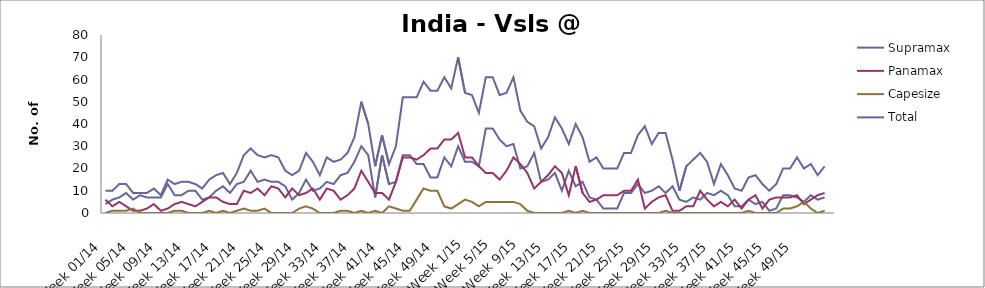
| Category | Supramax | Panamax | Capesize | Total |
|---|---|---|---|---|
| Week 01/14 | 4 | 6 | 0 | 10 |
| Week 02/14 | 6 | 3 | 1 | 10 |
| Week 03/14 | 7 | 5 | 1 | 13 |
| Week 04/14 | 9 | 3 | 1 | 13 |
| Week 05/14 | 6 | 1 | 2 | 9 |
| Week 06/14 | 8 | 1 | 0 | 9 |
| Week 07/14 | 7 | 2 | 0 | 9 |
| Week 08/14 | 7 | 4 | 0 | 11 |
| Week 09/14 | 7 | 1 | 0 | 8 |
| Week 10/14 | 13 | 2 | 0 | 15 |
| Week 11/14 | 8 | 4 | 1 | 13 |
| Week 12/14 | 8 | 5 | 1 | 14 |
| Week 13/14 | 10 | 4 | 0 | 14 |
| Week 14/14 | 10 | 3 | 0 | 13 |
| Week 15/14 | 6 | 5 | 0 | 11 |
| Week 16/14 | 7 | 7 | 1 | 15 |
| Week 17/14 | 10 | 7 | 0 | 17 |
| Week 18/14 | 12 | 5 | 1 | 18 |
| Week 19/14 | 9 | 4 | 0 | 13 |
| Week 20/14 | 13 | 4 | 1 | 18 |
| Week 21/14 | 14 | 10 | 2 | 26 |
| Week 22/14 | 19 | 9 | 1 | 29 |
| Week 23/14 | 14 | 11 | 1 | 26 |
| Week 24/14 | 15 | 8 | 2 | 25 |
| Week 25/14 | 14 | 12 | 0 | 26 |
| Week 26/14 | 14 | 11 | 0 | 25 |
| Week 27/14 | 12 | 7 | 0 | 19 |
| Week 28/14 | 6 | 11 | 0 | 17 |
| Week 29/14 | 9 | 8 | 2 | 19 |
| Week 30/14 | 15 | 9 | 3 | 27 |
| Week 31/14 | 10 | 11 | 2 | 23 |
| Week 32/14 | 11 | 6 | 0 | 17 |
| Week 33/14 | 14 | 11 | 0 | 25 |
| Week 34/14 | 13 | 10 | 0 | 23 |
| Week 35/14 | 17 | 6 | 1 | 24 |
| Week 36/14 | 18 | 8 | 1 | 27 |
| Week 37/14 | 23 | 11 | 0 | 34 |
| Week 38/14 | 30 | 19 | 1 | 50 |
| Week 39/14 | 26 | 14 | 0 | 40 |
| Week 40/14 | 7 | 9 | 1 | 21 |
| Week 41/14 | 26 | 9 | 0 | 35 |
| Week 42/14 | 13 | 6 | 3 | 22 |
| Week 43/14 | 14 | 14 | 2 | 30 |
| Week 44/14 | 26 | 25 | 1 | 52 |
| Week 45/14 | 26 | 25 | 1 | 52 |
| Week 46/14 | 22 | 24 | 6 | 52 |
| Week 47/14 | 22 | 26 | 11 | 59 |
| Week 48/14 | 16 | 29 | 10 | 55 |
| Week 49/14 | 16 | 29 | 10 | 55 |
| Week 50/14 | 25 | 33 | 3 | 61 |
| Week 51/14 | 21 | 33 | 2 | 56 |
| Week 52/14 | 30 | 36 | 4 | 70 |
| Week 1/15 | 23 | 25 | 6 | 54 |
| Week 2/15 | 23 | 25 | 5 | 53 |
| Week 3/15 | 21 | 21 | 3 | 45 |
| Week 4/15 | 38 | 18 | 5 | 61 |
| Week 5/15 | 38 | 18 | 5 | 61 |
| Week 6/15 | 33 | 15 | 5 | 53 |
| Week 7/15 | 30 | 19 | 5 | 54 |
| Week 8/15 | 31 | 25 | 5 | 61 |
| Week 9/15 | 20 | 22 | 4 | 46 |
| Week 10/15 | 21 | 18 | 1 | 41 |
| Week 11/15 | 27 | 11 | 0 | 39 |
| Week 12/15 | 14 | 14 | 0 | 29 |
| Week 13/15 | 15 | 17 | 0 | 34 |
| Week 14/15 | 18 | 21 | 0 | 43 |
| Week 15/15 | 10 | 18 | 0 | 38 |
| Week 16/15 | 19 | 8 | 1 | 31 |
| Week 17/15 | 12 | 21 | 0 | 40 |
| Week 18/15 | 14 | 9 | 1 | 34 |
| Week 19/15 | 7 | 5 | 0 | 23 |
| Week 20/15 | 6 | 6 | 0 | 25 |
| Week 21/15 | 2 | 8 | 0 | 20 |
| Week 22/15 | 2 | 8 | 0 | 20 |
| Week 23/15 | 2 | 8 | 0 | 20 |
| Week 24/15 | 9 | 10 | 0 | 27 |
| Week 25/15 | 9 | 10 | 0 | 27 |
| Week 26/15 | 13 | 15 | 0 | 35 |
| Week 27/15 | 9 | 2 | 0 | 39 |
| Week 28/15 | 10 | 5 | 0 | 31 |
| Week 29/15 | 12 | 7 | 0 | 36 |
| Week 30/15 | 9 | 8 | 1 | 36 |
| Week 31/15 | 12 | 1 | 0 | 24 |
| Week 32/15 | 6 | 1 | 0 | 10 |
| Week 33/15 | 5 | 3 | 0 | 21 |
| Week 34/15 | 7 | 3 | 0 | 24 |
| Week 35/15 | 6 | 10 | 0 | 27 |
| Week 36/15 | 9 | 6 | 0 | 23 |
| Week 37/15 | 8 | 3 | 0 | 13 |
| Week 38/15 | 10 | 5 | 0 | 22 |
| Week 39/15 | 8 | 3 | 0 | 17 |
| Week 40/15 | 3 | 6 | 0 | 11 |
| Week 41/15 | 3 | 2 | 0 | 10 |
| Week 42/15 | 6 | 6 | 1 | 16 |
| Week 43/15 | 4 | 8 | 0 | 17 |
| Week 44/15 | 5 | 2 | 0 | 13 |
| Week 45/15 | 1 | 6 | 0 | 10 |
| Week 46/15 | 2 | 7 | 0 | 13 |
| Week 47/15 | 8 | 7 | 2 | 20 |
| Week 48/15 | 8 | 7 | 2 | 20 |
| Week 49/15 | 7 | 8 | 3 | 25 |
| Week 50/15 | 5 | 4 | 5 | 20 |